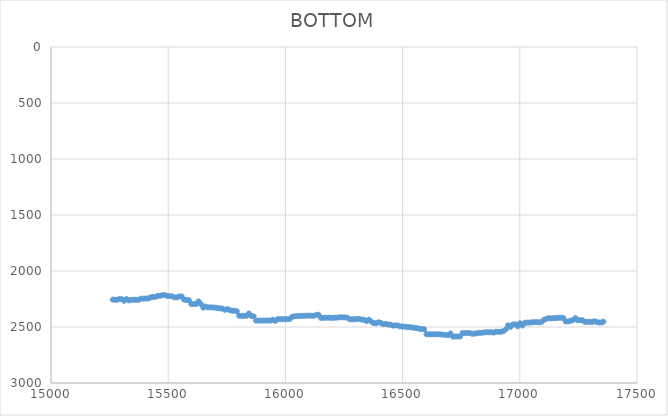
| Category | BOTTOM |
|---|---|
| 15263.7361 | 2255.32 |
| 15270.8699 | 2256.73 |
| 15281.1094 | 2256.73 |
| 15291.3494 | 2251.09 |
| 15301.5895 | 2251.09 |
| 15311.8295 | 2266.58 |
| 15322.0696 | 2249.69 |
| 15332.3096 | 2262.36 |
| 15342.5497 | 2256.73 |
| 15352.7898 | 2256.73 |
| 15363.0298 | 2256.73 |
| 15373.2699 | 2258.13 |
| 15383.5099 | 2246.87 |
| 15393.75 | 2246.87 |
| 15403.99 | 2245.46 |
| 15414.2301 | 2245.46 |
| 15424.4702 | 2235.61 |
| 15434.7102 | 2231.39 |
| 15444.9503 | 2231.39 |
| 15455.1903 | 2221.53 |
| 15465.4304 | 2221.53 |
| 15475.6704 | 2215.9 |
| 15485.9105 | 2215.9 |
| 15496.1505 | 2222.94 |
| 15506.3906 | 2224.35 |
| 15516.6307 | 2225.76 |
| 15526.8707 | 2235.61 |
| 15537.1108 | 2235.61 |
| 15547.3508 | 2227.17 |
| 15557.5909 | 2227.17 |
| 15567.8309 | 2255.32 |
| 15578.071 | 2259.54 |
| 15588.3111 | 2259.54 |
| 15598.5511 | 2294.73 |
| 15608.7912 | 2294.73 |
| 15619.0312 | 2294.73 |
| 15629.2713 | 2270.8 |
| 15639.5113 | 2294.73 |
| 15649.7514 | 2327.11 |
| 15659.9914 | 2317.25 |
| 15670.2315 | 2324.29 |
| 15680.4716 | 2324.29 |
| 15690.7116 | 2325.7 |
| 15700.9517 | 2327.11 |
| 15711.1917 | 2331.33 |
| 15721.4318 | 2334.14 |
| 15731.6718 | 2335.55 |
| 15741.9119 | 2346.81 |
| 15752.152 | 2339.77 |
| 15762.392 | 2349.63 |
| 15772.6321 | 2355.26 |
| 15782.8721 | 2355.26 |
| 15793.1122 | 2359.48 |
| 15803.3522 | 2400.3 |
| 15813.5923 | 2400.3 |
| 15823.8324 | 2400.3 |
| 15834.0724 | 2400.3 |
| 15844.3125 | 2379.19 |
| 15854.5525 | 2403.12 |
| 15864.7926 | 2404.53 |
| 15875.0326 | 2443.94 |
| 15885.2727 | 2442.53 |
| 15895.5127 | 2442.53 |
| 15905.7528 | 2442.53 |
| 15915.9929 | 2442.53 |
| 15926.2329 | 2442.53 |
| 15936.473 | 2442.53 |
| 15946.713 | 2435.49 |
| 15956.9531 | 2445.35 |
| 15967.1931 | 2429.86 |
| 15977.4332 | 2429.86 |
| 15987.6733 | 2429.86 |
| 15997.9133 | 2429.86 |
| 16008.1534 | 2429.86 |
| 16018.3934 | 2429.86 |
| 16028.6335 | 2408.75 |
| 16038.8735 | 2404.53 |
| 16049.1136 | 2403.12 |
| 16059.3536 | 2401.71 |
| 16069.5937 | 2400.3 |
| 16079.8338 | 2400.3 |
| 16090.0738 | 2398.89 |
| 16100.3139 | 2398.89 |
| 16110.5539 | 2398.89 |
| 16120.794 | 2400.3 |
| 16131.034 | 2393.26 |
| 16141.2741 | 2390.45 |
| 16151.5142 | 2418.6 |
| 16161.7542 | 2418.6 |
| 16171.9943 | 2417.19 |
| 16182.2343 | 2417.19 |
| 16192.4744 | 2417.19 |
| 16202.7144 | 2418.6 |
| 16212.9545 | 2415.79 |
| 16223.1946 | 2415.79 |
| 16233.4346 | 2412.97 |
| 16243.6747 | 2414.38 |
| 16253.9147 | 2414.38 |
| 16264.1548 | 2417.19 |
| 16274.3948 | 2431.27 |
| 16284.6349 | 2431.27 |
| 16294.8749 | 2431.27 |
| 16305.115 | 2428.45 |
| 16315.3551 | 2428.45 |
| 16325.5951 | 2434.08 |
| 16335.8352 | 2435.49 |
| 16346.0752 | 2446.75 |
| 16356.3153 | 2434.08 |
| 16366.5553 | 2450.98 |
| 16376.7954 | 2465.05 |
| 16387.0355 | 2466.46 |
| 16397.2755 | 2458.01 |
| 16407.5156 | 2463.64 |
| 16417.7556 | 2474.91 |
| 16427.9957 | 2472.09 |
| 16438.2357 | 2477.72 |
| 16448.4758 | 2479.13 |
| 16458.7159 | 2487.57 |
| 16468.9559 | 2486.17 |
| 16479.196 | 2486.17 |
| 16489.436 | 2494.61 |
| 16499.6761 | 2496.02 |
| 16509.9161 | 2497.43 |
| 16520.1562 | 2500.24 |
| 16530.3962 | 2501.65 |
| 16540.6363 | 2504.47 |
| 16550.8764 | 2507.28 |
| 16561.1164 | 2510.1 |
| 16571.3565 | 2515.73 |
| 16581.5965 | 2517.13 |
| 16591.8366 | 2519.95 |
| 16602.0766 | 2564.99 |
| 16612.3167 | 2564.99 |
| 16622.5568 | 2564.99 |
| 16632.7968 | 2564.99 |
| 16643.0369 | 2564.99 |
| 16653.2769 | 2564.99 |
| 16663.517 | 2566.4 |
| 16673.757 | 2569.22 |
| 16683.9971 | 2569.22 |
| 16694.2372 | 2572.03 |
| 16704.4772 | 2557.96 |
| 16714.7173 | 2586.11 |
| 16724.9573 | 2584.7 |
| 16735.1974 | 2584.7 |
| 16745.4374 | 2584.7 |
| 16755.6775 | 2553.73 |
| 16765.9175 | 2555.14 |
| 16776.1576 | 2553.73 |
| 16786.3977 | 2553.73 |
| 16796.6377 | 2560.77 |
| 16806.8778 | 2559.36 |
| 16817.1178 | 2555.14 |
| 16827.3579 | 2552.32 |
| 16837.5979 | 2552.32 |
| 16847.838 | 2548.1 |
| 16858.0781 | 2546.69 |
| 16868.3181 | 2546.69 |
| 16878.5582 | 2546.69 |
| 16888.7982 | 2549.51 |
| 16899.0383 | 2542.47 |
| 16909.2783 | 2542.47 |
| 16919.5184 | 2542.47 |
| 16929.7585 | 2536.84 |
| 16939.9985 | 2521.36 |
| 16950.2386 | 2484.76 |
| 16960.4786 | 2498.84 |
| 16970.7187 | 2477.72 |
| 16980.9587 | 2476.31 |
| 16991.1988 | 2493.2 |
| 17001.4388 | 2466.46 |
| 17011.6789 | 2486.17 |
| 17021.919 | 2462.24 |
| 17032.159 | 2460.83 |
| 17042.3991 | 2460.83 |
| 17052.6391 | 2458.01 |
| 17062.8792 | 2456.61 |
| 17073.1192 | 2456.61 |
| 17083.3593 | 2458.01 |
| 17093.5994 | 2453.79 |
| 17103.8394 | 2434.08 |
| 17114.0795 | 2425.64 |
| 17124.3195 | 2421.42 |
| 17134.5596 | 2422.82 |
| 17144.7996 | 2421.42 |
| 17155.0397 | 2420.01 |
| 17165.2798 | 2417.19 |
| 17175.5198 | 2417.19 |
| 17185.7599 | 2420.01 |
| 17195.9999 | 2450.98 |
| 17206.24 | 2449.57 |
| 17216.48 | 2443.94 |
| 17226.7201 | 2438.31 |
| 17236.9601 | 2420.01 |
| 17247.2002 | 2439.72 |
| 17257.4403 | 2439.72 |
| 17267.6803 | 2439.72 |
| 17277.9204 | 2455.2 |
| 17288.1604 | 2453.79 |
| 17298.4005 | 2453.79 |
| 17308.6405 | 2455.2 |
| 17318.8806 | 2448.16 |
| 17329.1207 | 2456.61 |
| 17339.3607 | 2459.42 |
| 17349.6007 | 2459.42 |
| 17356.7815 | 2452.38 |